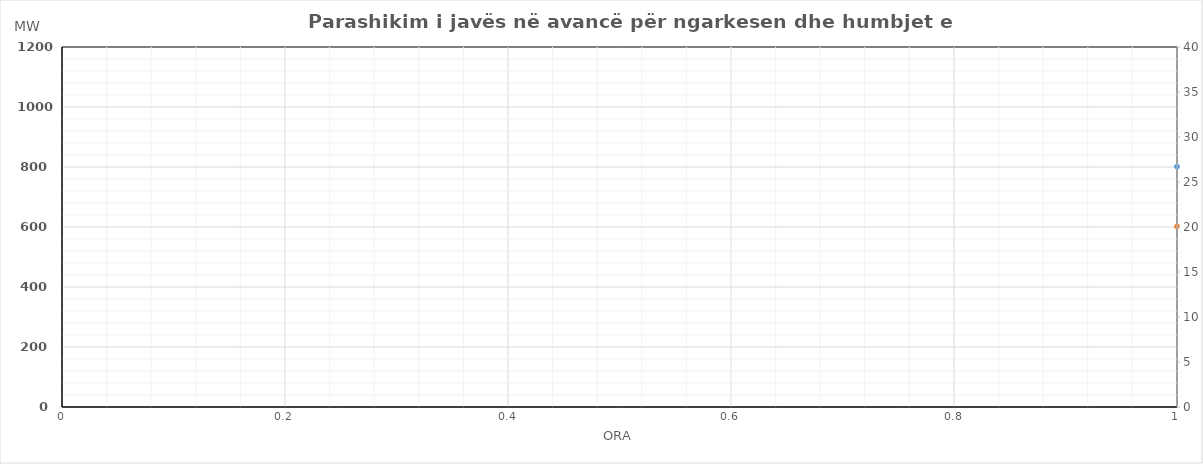
| Category | Ngarkesa (MWh) |
|---|---|
| 0 | 602.056 |
| 1 | 543.395 |
| 2 | 514.101 |
| 3 | 506.513 |
| 4 | 512.138 |
| 5 | 570.008 |
| 6 | 703.661 |
| 7 | 878.339 |
| 8 | 976.728 |
| 9 | 993.458 |
| 10 | 939.48 |
| 11 | 923.848 |
| 12 | 914.237 |
| 13 | 937.494 |
| 14 | 948.142 |
| 15 | 972.896 |
| 16 | 1055.144 |
| 17 | 1136.186 |
| 18 | 1130.875 |
| 19 | 1123.348 |
| 20 | 1106.785 |
| 21 | 1022.764 |
| 22 | 881.243 |
| 23 | 729.602 |
| 24 | 595.409 |
| 25 | 536.333 |
| 26 | 506.922 |
| 27 | 499.475 |
| 28 | 492.67 |
| 29 | 542.333 |
| 30 | 635.97 |
| 31 | 770.83 |
| 32 | 901.518 |
| 33 | 954.179 |
| 34 | 955.155 |
| 35 | 939.987 |
| 36 | 935.066 |
| 37 | 946.296 |
| 38 | 939.474 |
| 39 | 957.942 |
| 40 | 1026.548 |
| 41 | 1080.235 |
| 42 | 1069.005 |
| 43 | 1052.032 |
| 44 | 1033.343 |
| 45 | 956.931 |
| 46 | 839.296 |
| 47 | 707.695 |
| 48 | 596.291 |
| 49 | 526.939 |
| 50 | 509.508 |
| 51 | 505.907 |
| 52 | 498.327 |
| 53 | 554.755 |
| 54 | 670.975 |
| 55 | 832.335 |
| 56 | 932.009 |
| 57 | 962.518 |
| 58 | 957.548 |
| 59 | 945.405 |
| 60 | 939.171 |
| 61 | 940.129 |
| 62 | 934.306 |
| 63 | 941.1 |
| 64 | 999.632 |
| 65 | 1049.581 |
| 66 | 1037.997 |
| 67 | 1015.037 |
| 68 | 976.737 |
| 69 | 907.203 |
| 70 | 800.163 |
| 71 | 690.399 |
| 72 | 606.5 |
| 73 | 544.862 |
| 74 | 523.906 |
| 75 | 519.777 |
| 76 | 525.043 |
| 77 | 576.513 |
| 78 | 693.711 |
| 79 | 847.09 |
| 80 | 942.059 |
| 81 | 959.534 |
| 82 | 931.213 |
| 83 | 911.955 |
| 84 | 901.121 |
| 85 | 910.261 |
| 86 | 912.602 |
| 87 | 928.097 |
| 88 | 995.871 |
| 89 | 1066.484 |
| 90 | 1053.75 |
| 91 | 1040.932 |
| 92 | 1023.01 |
| 93 | 950.9 |
| 94 | 824.847 |
| 95 | 697.408 |
| 96 | 592.952 |
| 97 | 534.772 |
| 98 | 505.373 |
| 99 | 495.839 |
| 100 | 500.304 |
| 101 | 554.289 |
| 102 | 692.54 |
| 103 | 881.347 |
| 104 | 966.508 |
| 105 | 977.391 |
| 106 | 951.921 |
| 107 | 934.407 |
| 108 | 923.912 |
| 109 | 948.46 |
| 110 | 962.946 |
| 111 | 978.515 |
| 112 | 1044.049 |
| 113 | 1114.724 |
| 114 | 1107.465 |
| 115 | 1099.795 |
| 116 | 1076.496 |
| 117 | 993.641 |
| 118 | 856.923 |
| 119 | 709.49 |
| 120 | 612.324 |
| 121 | 542.744 |
| 122 | 513.681 |
| 123 | 509.786 |
| 124 | 518.45 |
| 125 | 577.527 |
| 126 | 715.953 |
| 127 | 906.41 |
| 128 | 1000.756 |
| 129 | 1017.049 |
| 130 | 997.285 |
| 131 | 973.808 |
| 132 | 972.098 |
| 133 | 992.228 |
| 134 | 1009.056 |
| 135 | 1028.113 |
| 136 | 1089.509 |
| 137 | 1141.457 |
| 138 | 1128.485 |
| 139 | 1105.446 |
| 140 | 1069.002 |
| 141 | 978.502 |
| 142 | 834.152 |
| 143 | 696.076 |
| 144 | 607.22 |
| 145 | 533.782 |
| 146 | 506.482 |
| 147 | 502.851 |
| 148 | 505.091 |
| 149 | 566.648 |
| 150 | 704.585 |
| 151 | 899.032 |
| 152 | 995.731 |
| 153 | 1018.541 |
| 154 | 1010.453 |
| 155 | 990.533 |
| 156 | 991.123 |
| 157 | 1007.162 |
| 158 | 1019.909 |
| 159 | 1034.615 |
| 160 | 1091.389 |
| 161 | 1133.006 |
| 162 | 1120.608 |
| 163 | 1092.498 |
| 164 | 1045.865 |
| 165 | 956.654 |
| 166 | 821.81 |
| 167 | 692.571 |